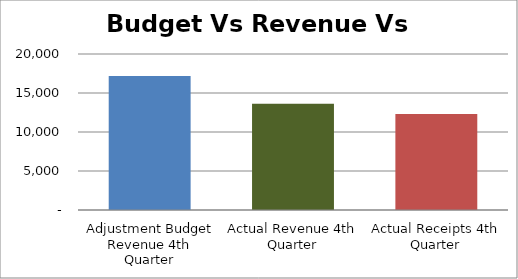
| Category | Series 0 |
|---|---|
| Adjustment Budget Revenue 4th Quarter | 17168 |
| Actual Revenue 4th Quarter | 13633 |
| Actual Receipts 4th Quarter | 12321 |